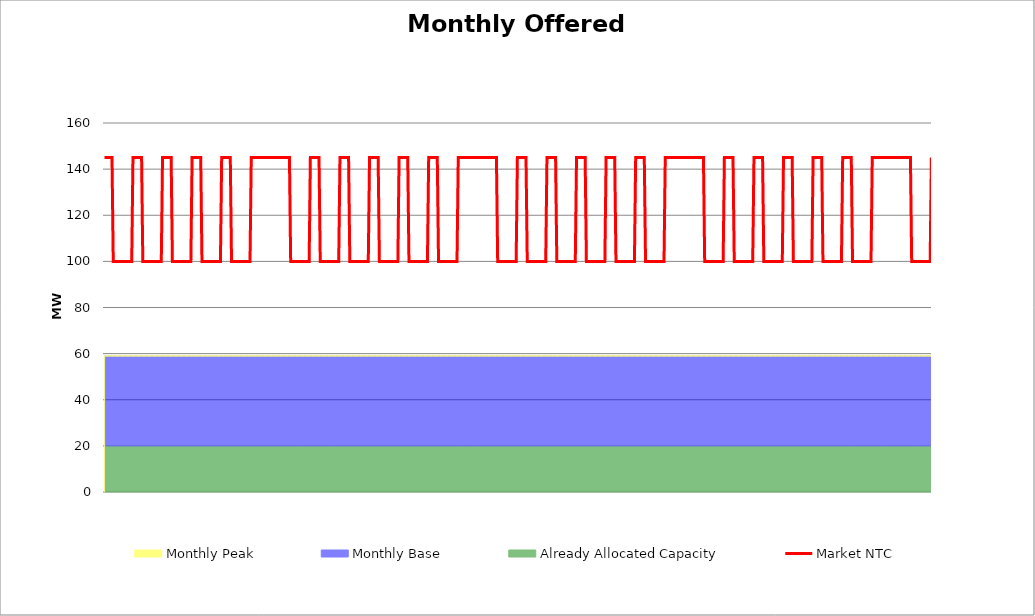
| Category | Market NTC |
|---|---|
| 0 | 145 |
| 1 | 145 |
| 2 | 145 |
| 3 | 145 |
| 4 | 145 |
| 5 | 145 |
| 6 | 145 |
| 7 | 100 |
| 8 | 100 |
| 9 | 100 |
| 10 | 100 |
| 11 | 100 |
| 12 | 100 |
| 13 | 100 |
| 14 | 100 |
| 15 | 100 |
| 16 | 100 |
| 17 | 100 |
| 18 | 100 |
| 19 | 100 |
| 20 | 100 |
| 21 | 100 |
| 22 | 100 |
| 23 | 145 |
| 24 | 145 |
| 25 | 145 |
| 26 | 145 |
| 27 | 145 |
| 28 | 145 |
| 29 | 145 |
| 30 | 145 |
| 31 | 100 |
| 32 | 100 |
| 33 | 100 |
| 34 | 100 |
| 35 | 100 |
| 36 | 100 |
| 37 | 100 |
| 38 | 100 |
| 39 | 100 |
| 40 | 100 |
| 41 | 100 |
| 42 | 100 |
| 43 | 100 |
| 44 | 100 |
| 45 | 100 |
| 46 | 100 |
| 47 | 145 |
| 48 | 145 |
| 49 | 145 |
| 50 | 145 |
| 51 | 145 |
| 52 | 145 |
| 53 | 145 |
| 54 | 145 |
| 55 | 100 |
| 56 | 100 |
| 57 | 100 |
| 58 | 100 |
| 59 | 100 |
| 60 | 100 |
| 61 | 100 |
| 62 | 100 |
| 63 | 100 |
| 64 | 100 |
| 65 | 100 |
| 66 | 100 |
| 67 | 100 |
| 68 | 100 |
| 69 | 100 |
| 70 | 100 |
| 71 | 145 |
| 72 | 145 |
| 73 | 145 |
| 74 | 145 |
| 75 | 145 |
| 76 | 145 |
| 77 | 145 |
| 78 | 145 |
| 79 | 100 |
| 80 | 100 |
| 81 | 100 |
| 82 | 100 |
| 83 | 100 |
| 84 | 100 |
| 85 | 100 |
| 86 | 100 |
| 87 | 100 |
| 88 | 100 |
| 89 | 100 |
| 90 | 100 |
| 91 | 100 |
| 92 | 100 |
| 93 | 100 |
| 94 | 100 |
| 95 | 145 |
| 96 | 145 |
| 97 | 145 |
| 98 | 145 |
| 99 | 145 |
| 100 | 145 |
| 101 | 145 |
| 102 | 145 |
| 103 | 100 |
| 104 | 100 |
| 105 | 100 |
| 106 | 100 |
| 107 | 100 |
| 108 | 100 |
| 109 | 100 |
| 110 | 100 |
| 111 | 100 |
| 112 | 100 |
| 113 | 100 |
| 114 | 100 |
| 115 | 100 |
| 116 | 100 |
| 117 | 100 |
| 118 | 100 |
| 119 | 145 |
| 120 | 145 |
| 121 | 145 |
| 122 | 145 |
| 123 | 145 |
| 124 | 145 |
| 125 | 145 |
| 126 | 145 |
| 127 | 145 |
| 128 | 145 |
| 129 | 145 |
| 130 | 145 |
| 131 | 145 |
| 132 | 145 |
| 133 | 145 |
| 134 | 145 |
| 135 | 145 |
| 136 | 145 |
| 137 | 145 |
| 138 | 145 |
| 139 | 145 |
| 140 | 145 |
| 141 | 145 |
| 142 | 145 |
| 143 | 145 |
| 144 | 145 |
| 145 | 145 |
| 146 | 145 |
| 147 | 145 |
| 148 | 145 |
| 149 | 145 |
| 150 | 145 |
| 151 | 100 |
| 152 | 100 |
| 153 | 100 |
| 154 | 100 |
| 155 | 100 |
| 156 | 100 |
| 157 | 100 |
| 158 | 100 |
| 159 | 100 |
| 160 | 100 |
| 161 | 100 |
| 162 | 100 |
| 163 | 100 |
| 164 | 100 |
| 165 | 100 |
| 166 | 100 |
| 167 | 145 |
| 168 | 145 |
| 169 | 145 |
| 170 | 145 |
| 171 | 145 |
| 172 | 145 |
| 173 | 145 |
| 174 | 145 |
| 175 | 100 |
| 176 | 100 |
| 177 | 100 |
| 178 | 100 |
| 179 | 100 |
| 180 | 100 |
| 181 | 100 |
| 182 | 100 |
| 183 | 100 |
| 184 | 100 |
| 185 | 100 |
| 186 | 100 |
| 187 | 100 |
| 188 | 100 |
| 189 | 100 |
| 190 | 100 |
| 191 | 145 |
| 192 | 145 |
| 193 | 145 |
| 194 | 145 |
| 195 | 145 |
| 196 | 145 |
| 197 | 145 |
| 198 | 145 |
| 199 | 100 |
| 200 | 100 |
| 201 | 100 |
| 202 | 100 |
| 203 | 100 |
| 204 | 100 |
| 205 | 100 |
| 206 | 100 |
| 207 | 100 |
| 208 | 100 |
| 209 | 100 |
| 210 | 100 |
| 211 | 100 |
| 212 | 100 |
| 213 | 100 |
| 214 | 100 |
| 215 | 145 |
| 216 | 145 |
| 217 | 145 |
| 218 | 145 |
| 219 | 145 |
| 220 | 145 |
| 221 | 145 |
| 222 | 145 |
| 223 | 100 |
| 224 | 100 |
| 225 | 100 |
| 226 | 100 |
| 227 | 100 |
| 228 | 100 |
| 229 | 100 |
| 230 | 100 |
| 231 | 100 |
| 232 | 100 |
| 233 | 100 |
| 234 | 100 |
| 235 | 100 |
| 236 | 100 |
| 237 | 100 |
| 238 | 100 |
| 239 | 145 |
| 240 | 145 |
| 241 | 145 |
| 242 | 145 |
| 243 | 145 |
| 244 | 145 |
| 245 | 145 |
| 246 | 145 |
| 247 | 100 |
| 248 | 100 |
| 249 | 100 |
| 250 | 100 |
| 251 | 100 |
| 252 | 100 |
| 253 | 100 |
| 254 | 100 |
| 255 | 100 |
| 256 | 100 |
| 257 | 100 |
| 258 | 100 |
| 259 | 100 |
| 260 | 100 |
| 261 | 100 |
| 262 | 100 |
| 263 | 145 |
| 264 | 145 |
| 265 | 145 |
| 266 | 145 |
| 267 | 145 |
| 268 | 145 |
| 269 | 145 |
| 270 | 145 |
| 271 | 100 |
| 272 | 100 |
| 273 | 100 |
| 274 | 100 |
| 275 | 100 |
| 276 | 100 |
| 277 | 100 |
| 278 | 100 |
| 279 | 100 |
| 280 | 100 |
| 281 | 100 |
| 282 | 100 |
| 283 | 100 |
| 284 | 100 |
| 285 | 100 |
| 286 | 100 |
| 287 | 145 |
| 288 | 145 |
| 289 | 145 |
| 290 | 145 |
| 291 | 145 |
| 292 | 145 |
| 293 | 145 |
| 294 | 145 |
| 295 | 145 |
| 296 | 145 |
| 297 | 145 |
| 298 | 145 |
| 299 | 145 |
| 300 | 145 |
| 301 | 145 |
| 302 | 145 |
| 303 | 145 |
| 304 | 145 |
| 305 | 145 |
| 306 | 145 |
| 307 | 145 |
| 308 | 145 |
| 309 | 145 |
| 310 | 145 |
| 311 | 145 |
| 312 | 145 |
| 313 | 145 |
| 314 | 145 |
| 315 | 145 |
| 316 | 145 |
| 317 | 145 |
| 318 | 145 |
| 319 | 100 |
| 320 | 100 |
| 321 | 100 |
| 322 | 100 |
| 323 | 100 |
| 324 | 100 |
| 325 | 100 |
| 326 | 100 |
| 327 | 100 |
| 328 | 100 |
| 329 | 100 |
| 330 | 100 |
| 331 | 100 |
| 332 | 100 |
| 333 | 100 |
| 334 | 100 |
| 335 | 145 |
| 336 | 145 |
| 337 | 145 |
| 338 | 145 |
| 339 | 145 |
| 340 | 145 |
| 341 | 145 |
| 342 | 145 |
| 343 | 100 |
| 344 | 100 |
| 345 | 100 |
| 346 | 100 |
| 347 | 100 |
| 348 | 100 |
| 349 | 100 |
| 350 | 100 |
| 351 | 100 |
| 352 | 100 |
| 353 | 100 |
| 354 | 100 |
| 355 | 100 |
| 356 | 100 |
| 357 | 100 |
| 358 | 100 |
| 359 | 145 |
| 360 | 145 |
| 361 | 145 |
| 362 | 145 |
| 363 | 145 |
| 364 | 145 |
| 365 | 145 |
| 366 | 145 |
| 367 | 100 |
| 368 | 100 |
| 369 | 100 |
| 370 | 100 |
| 371 | 100 |
| 372 | 100 |
| 373 | 100 |
| 374 | 100 |
| 375 | 100 |
| 376 | 100 |
| 377 | 100 |
| 378 | 100 |
| 379 | 100 |
| 380 | 100 |
| 381 | 100 |
| 382 | 100 |
| 383 | 145 |
| 384 | 145 |
| 385 | 145 |
| 386 | 145 |
| 387 | 145 |
| 388 | 145 |
| 389 | 145 |
| 390 | 145 |
| 391 | 100 |
| 392 | 100 |
| 393 | 100 |
| 394 | 100 |
| 395 | 100 |
| 396 | 100 |
| 397 | 100 |
| 398 | 100 |
| 399 | 100 |
| 400 | 100 |
| 401 | 100 |
| 402 | 100 |
| 403 | 100 |
| 404 | 100 |
| 405 | 100 |
| 406 | 100 |
| 407 | 145 |
| 408 | 145 |
| 409 | 145 |
| 410 | 145 |
| 411 | 145 |
| 412 | 145 |
| 413 | 145 |
| 414 | 145 |
| 415 | 100 |
| 416 | 100 |
| 417 | 100 |
| 418 | 100 |
| 419 | 100 |
| 420 | 100 |
| 421 | 100 |
| 422 | 100 |
| 423 | 100 |
| 424 | 100 |
| 425 | 100 |
| 426 | 100 |
| 427 | 100 |
| 428 | 100 |
| 429 | 100 |
| 430 | 100 |
| 431 | 145 |
| 432 | 145 |
| 433 | 145 |
| 434 | 145 |
| 435 | 145 |
| 436 | 145 |
| 437 | 145 |
| 438 | 145 |
| 439 | 100 |
| 440 | 100 |
| 441 | 100 |
| 442 | 100 |
| 443 | 100 |
| 444 | 100 |
| 445 | 100 |
| 446 | 100 |
| 447 | 100 |
| 448 | 100 |
| 449 | 100 |
| 450 | 100 |
| 451 | 100 |
| 452 | 100 |
| 453 | 100 |
| 454 | 100 |
| 455 | 145 |
| 456 | 145 |
| 457 | 145 |
| 458 | 145 |
| 459 | 145 |
| 460 | 145 |
| 461 | 145 |
| 462 | 145 |
| 463 | 145 |
| 464 | 145 |
| 465 | 145 |
| 466 | 145 |
| 467 | 145 |
| 468 | 145 |
| 469 | 145 |
| 470 | 145 |
| 471 | 145 |
| 472 | 145 |
| 473 | 145 |
| 474 | 145 |
| 475 | 145 |
| 476 | 145 |
| 477 | 145 |
| 478 | 145 |
| 479 | 145 |
| 480 | 145 |
| 481 | 145 |
| 482 | 145 |
| 483 | 145 |
| 484 | 145 |
| 485 | 145 |
| 486 | 145 |
| 487 | 100 |
| 488 | 100 |
| 489 | 100 |
| 490 | 100 |
| 491 | 100 |
| 492 | 100 |
| 493 | 100 |
| 494 | 100 |
| 495 | 100 |
| 496 | 100 |
| 497 | 100 |
| 498 | 100 |
| 499 | 100 |
| 500 | 100 |
| 501 | 100 |
| 502 | 100 |
| 503 | 145 |
| 504 | 145 |
| 505 | 145 |
| 506 | 145 |
| 507 | 145 |
| 508 | 145 |
| 509 | 145 |
| 510 | 145 |
| 511 | 100 |
| 512 | 100 |
| 513 | 100 |
| 514 | 100 |
| 515 | 100 |
| 516 | 100 |
| 517 | 100 |
| 518 | 100 |
| 519 | 100 |
| 520 | 100 |
| 521 | 100 |
| 522 | 100 |
| 523 | 100 |
| 524 | 100 |
| 525 | 100 |
| 526 | 100 |
| 527 | 145 |
| 528 | 145 |
| 529 | 145 |
| 530 | 145 |
| 531 | 145 |
| 532 | 145 |
| 533 | 145 |
| 534 | 145 |
| 535 | 100 |
| 536 | 100 |
| 537 | 100 |
| 538 | 100 |
| 539 | 100 |
| 540 | 100 |
| 541 | 100 |
| 542 | 100 |
| 543 | 100 |
| 544 | 100 |
| 545 | 100 |
| 546 | 100 |
| 547 | 100 |
| 548 | 100 |
| 549 | 100 |
| 550 | 100 |
| 551 | 145 |
| 552 | 145 |
| 553 | 145 |
| 554 | 145 |
| 555 | 145 |
| 556 | 145 |
| 557 | 145 |
| 558 | 145 |
| 559 | 100 |
| 560 | 100 |
| 561 | 100 |
| 562 | 100 |
| 563 | 100 |
| 564 | 100 |
| 565 | 100 |
| 566 | 100 |
| 567 | 100 |
| 568 | 100 |
| 569 | 100 |
| 570 | 100 |
| 571 | 100 |
| 572 | 100 |
| 573 | 100 |
| 574 | 100 |
| 575 | 145 |
| 576 | 145 |
| 577 | 145 |
| 578 | 145 |
| 579 | 145 |
| 580 | 145 |
| 581 | 145 |
| 582 | 145 |
| 583 | 100 |
| 584 | 100 |
| 585 | 100 |
| 586 | 100 |
| 587 | 100 |
| 588 | 100 |
| 589 | 100 |
| 590 | 100 |
| 591 | 100 |
| 592 | 100 |
| 593 | 100 |
| 594 | 100 |
| 595 | 100 |
| 596 | 100 |
| 597 | 100 |
| 598 | 100 |
| 599 | 145 |
| 600 | 145 |
| 601 | 145 |
| 602 | 145 |
| 603 | 145 |
| 604 | 145 |
| 605 | 145 |
| 606 | 145 |
| 607 | 100 |
| 608 | 100 |
| 609 | 100 |
| 610 | 100 |
| 611 | 100 |
| 612 | 100 |
| 613 | 100 |
| 614 | 100 |
| 615 | 100 |
| 616 | 100 |
| 617 | 100 |
| 618 | 100 |
| 619 | 100 |
| 620 | 100 |
| 621 | 100 |
| 622 | 100 |
| 623 | 145 |
| 624 | 145 |
| 625 | 145 |
| 626 | 145 |
| 627 | 145 |
| 628 | 145 |
| 629 | 145 |
| 630 | 145 |
| 631 | 145 |
| 632 | 145 |
| 633 | 145 |
| 634 | 145 |
| 635 | 145 |
| 636 | 145 |
| 637 | 145 |
| 638 | 145 |
| 639 | 145 |
| 640 | 145 |
| 641 | 145 |
| 642 | 145 |
| 643 | 145 |
| 644 | 145 |
| 645 | 145 |
| 646 | 145 |
| 647 | 145 |
| 648 | 145 |
| 649 | 145 |
| 650 | 145 |
| 651 | 145 |
| 652 | 145 |
| 653 | 145 |
| 654 | 145 |
| 655 | 100 |
| 656 | 100 |
| 657 | 100 |
| 658 | 100 |
| 659 | 100 |
| 660 | 100 |
| 661 | 100 |
| 662 | 100 |
| 663 | 100 |
| 664 | 100 |
| 665 | 100 |
| 666 | 100 |
| 667 | 100 |
| 668 | 100 |
| 669 | 100 |
| 670 | 100 |
| 671 | 145 |